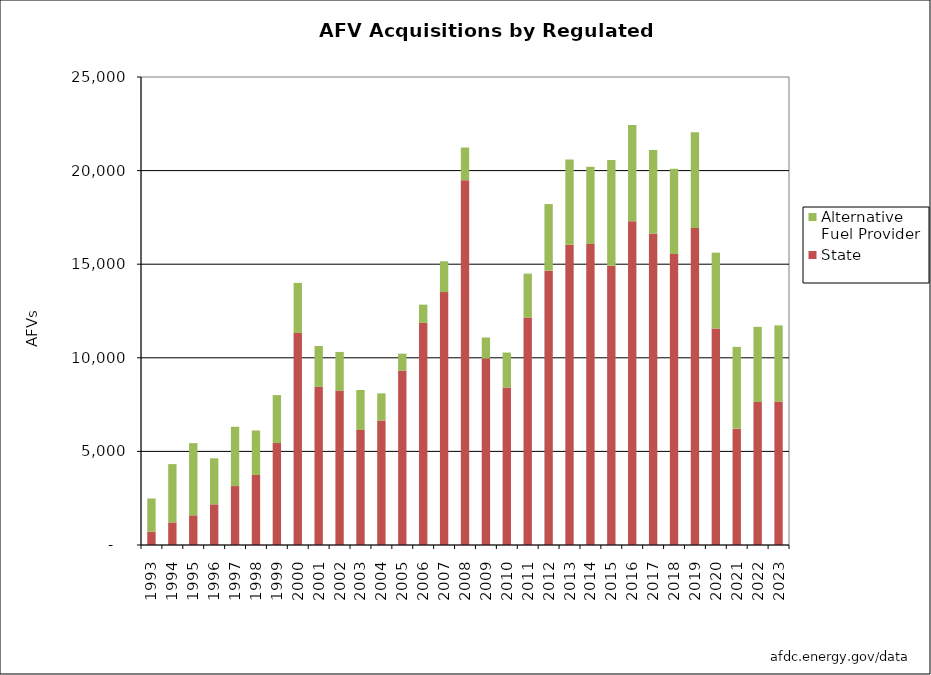
| Category | State   | Alternative Fuel Provider |
|---|---|---|
| 1993.0 | 705 | 1778 |
| 1994.0 | 1208 | 3113 |
| 1995.0 | 1587 | 3855 |
| 1996.0 | 2174 | 2457 |
| 1997.0 | 3148 | 3169 |
| 1998.0 | 3741 | 2378 |
| 1999.0 | 5443 | 2564 |
| 2000.0 | 11327 | 2676 |
| 2001.0 | 8448 | 2184 |
| 2002.0 | 8248 | 2065 |
| 2003.0 | 6143 | 2137 |
| 2004.0 | 6652 | 1449 |
| 2005.0 | 9316 | 906 |
| 2006.0 | 11863 | 977 |
| 2007.0 | 13510 | 1646 |
| 2008.0 | 19488 | 1745 |
| 2009.0 | 9971 | 1113 |
| 2010.0 | 8412 | 1869 |
| 2011.0 | 12150 | 2346 |
| 2012.0 | 14655 | 3558 |
| 2013.0 | 16042 | 4552 |
| 2014.0 | 16077 | 4129 |
| 2015.0 | 14916 | 5655 |
| 2016.0 | 17296 | 5139 |
| 2017.0 | 16644 | 4458 |
| 2018.0 | 15544 | 4551 |
| 2019.0 | 16935 | 5107 |
| 2020.0 | 11566 | 4051 |
| 2021.0 | 6215 | 4367 |
| 2022.0 | 7639 | 4016 |
| 2023.0 | 7669 | 4062 |